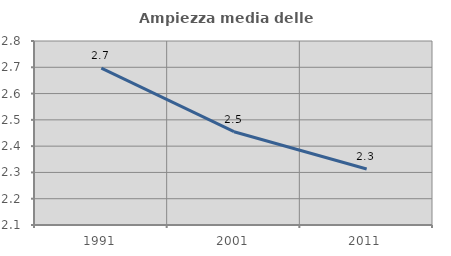
| Category | Ampiezza media delle famiglie |
|---|---|
| 1991.0 | 2.697 |
| 2001.0 | 2.455 |
| 2011.0 | 2.313 |